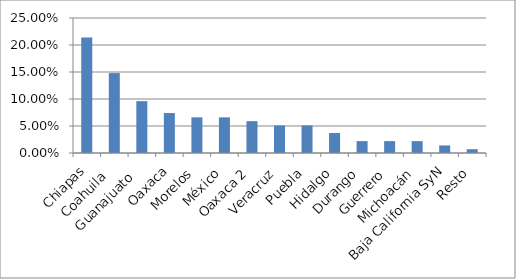
| Category | Series 0 |
|---|---|
| Chiapas | 0.214 |
| Coahuila  | 0.148 |
| Guanajuato  | 0.096 |
| Oaxaca | 0.074 |
| Morelos | 0.066 |
| México | 0.066 |
| Oaxaca 2 | 0.059 |
| Veracruz | 0.051 |
| Puebla | 0.051 |
| Hidalgo | 0.037 |
| Durango | 0.022 |
| Guerrero | 0.022 |
| Michoacán | 0.022 |
| Baja California SyN | 0.014 |
| Resto | 0.007 |